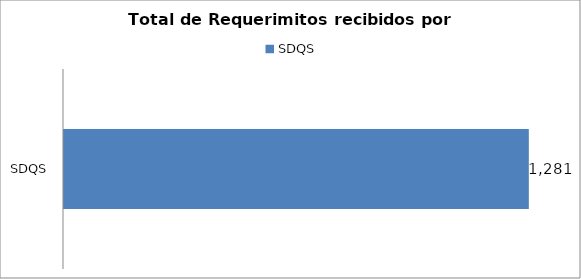
| Category | Total |
|---|---|
| SDQS | 1281 |